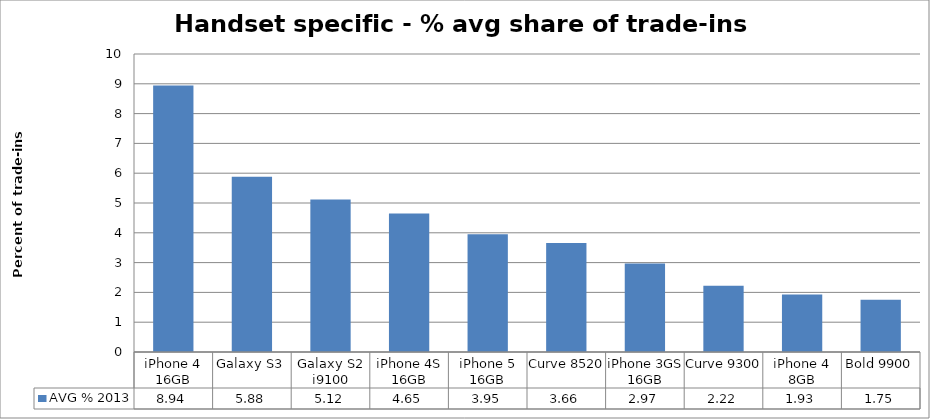
| Category | AVG % 2013 |
|---|---|
| iPhone 4 16GB | 8.94 |
| Galaxy S3 | 5.88 |
| Galaxy S2 i9100 | 5.12 |
| iPhone 4S 16GB | 4.65 |
| iPhone 5 16GB | 3.95 |
| Curve 8520 | 3.66 |
| iPhone 3GS 16GB | 2.97 |
| Curve 9300 | 2.22 |
| iPhone 4 8GB | 1.93 |
| Bold 9900 | 1.75 |